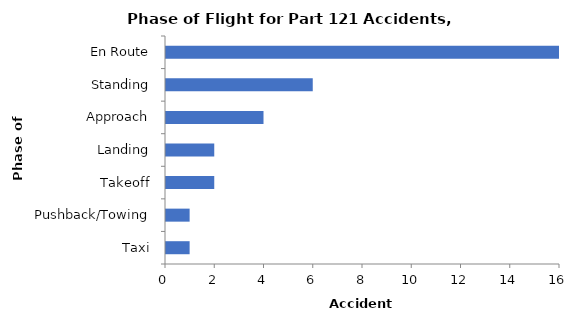
| Category | Accident Aircraft |
|---|---|
| En Route | 16 |
| Standing | 6 |
| Approach | 4 |
| Landing | 2 |
| Takeoff | 2 |
| Pushback/Towing | 1 |
| Taxi | 1 |